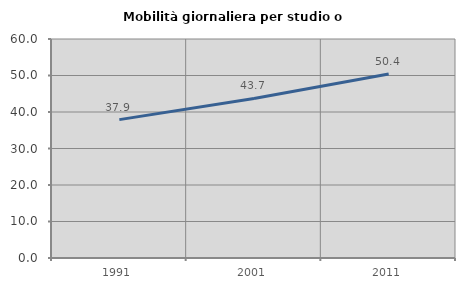
| Category | Mobilità giornaliera per studio o lavoro |
|---|---|
| 1991.0 | 37.914 |
| 2001.0 | 43.716 |
| 2011.0 | 50.388 |